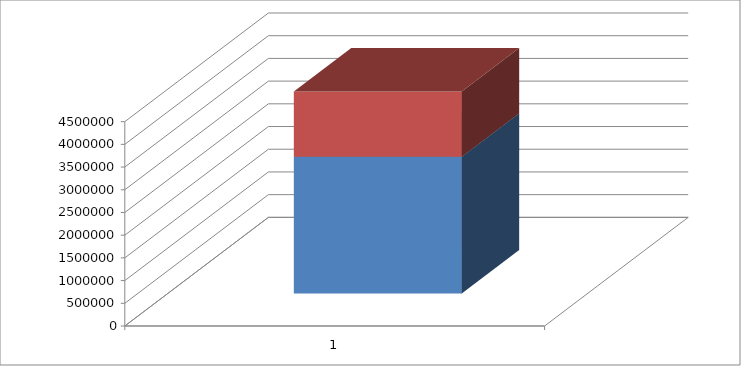
| Category | Series 0 | Series 1 |
|---|---|---|
| 0 | 3008700 | 1437800 |